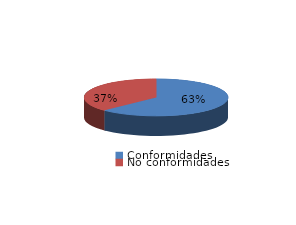
| Category | Series 0 |
|---|---|
| Conformidades | 1146 |
| No conformidades | 684 |